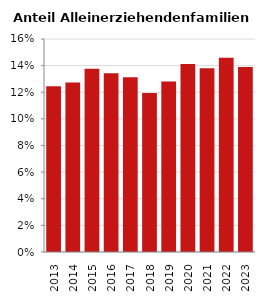
| Category | Anteil Alleinerziehende an Familien |
|---|---|
| 2013.0 | 0.125 |
| 2014.0 | 0.127 |
| 2015.0 | 0.138 |
| 2016.0 | 0.134 |
| 2017.0 | 0.131 |
| 2018.0 | 0.119 |
| 2019.0 | 0.128 |
| 2020.0 | 0.141 |
| 2021.0 | 0.138 |
| 2022.0 | 0.146 |
| 2023.0 | 0.139 |